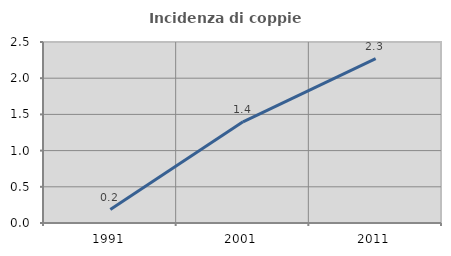
| Category | Incidenza di coppie miste |
|---|---|
| 1991.0 | 0.185 |
| 2001.0 | 1.397 |
| 2011.0 | 2.269 |